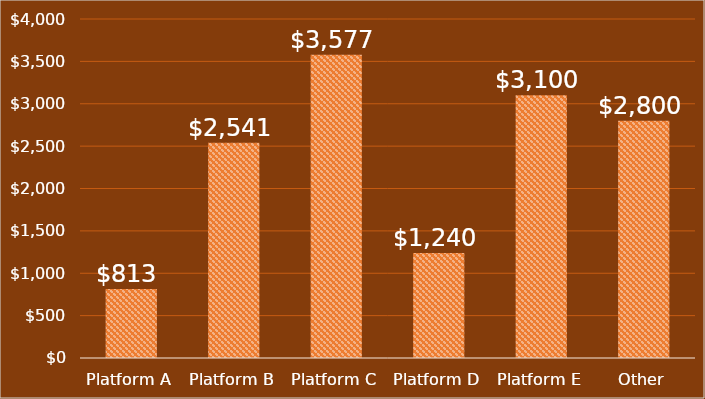
| Category | Profit per Acquisition |
|---|---|
| Platform A | 813 |
| Platform B | 2541 |
| Platform C | 3577 |
| Platform D | 1240 |
| Platform E | 3100 |
| Other | 2800 |